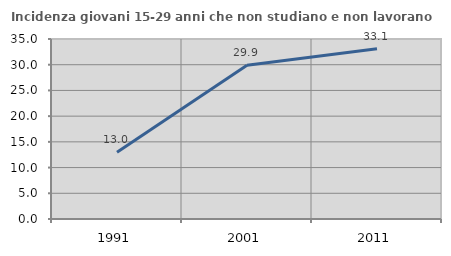
| Category | Incidenza giovani 15-29 anni che non studiano e non lavorano  |
|---|---|
| 1991.0 | 12.986 |
| 2001.0 | 29.913 |
| 2011.0 | 33.115 |